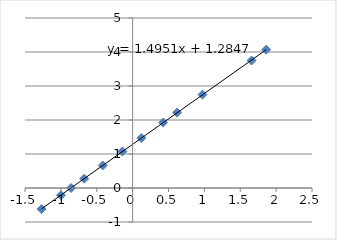
| Category | Series 0 |
|---|---|
| -1.27037676331964 | -0.618 |
| -0.99885781338247 | -0.211 |
| -0.858197742877806 | 0 |
| -0.675295038616703 | 0.274 |
| -0.416014191473425 | 0.663 |
| -0.141953853661594 | 1.074 |
| 0.12120945754709 | 1.469 |
| 0.424864605606527 | 1.925 |
| 0.619934866806132 | 2.217 |
| 0.973428405391434 | 2.745 |
| 1.65768134847145 | 3.75 |
| 1.86146974422774 | 4.068 |